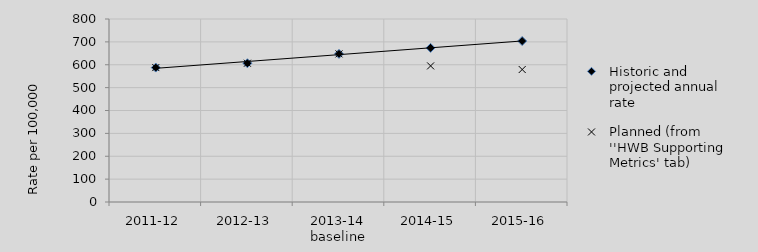
| Category | Historic and projected annual rate | Planned (from ''HWB Supporting Metrics' tab) |
|---|---|---|
| 2011-12 | 587.7 | 587.7 |
| 2012-13 | 606.6 | 606.6 |
| 2013-14 baseline | 647.5 | 647.5 |
| 2014-15 | 673.733 | 594.946 |
| 2015-16 | 703.633 | 579.122 |